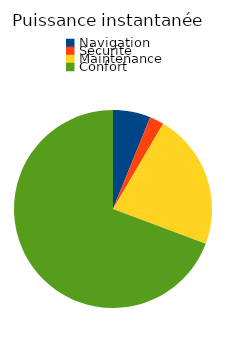
| Category | Series 0 |
|---|---|
| Navigation | 530 |
| Sécurité | 200 |
| Maintenance | 1920 |
| Confort | 5980 |